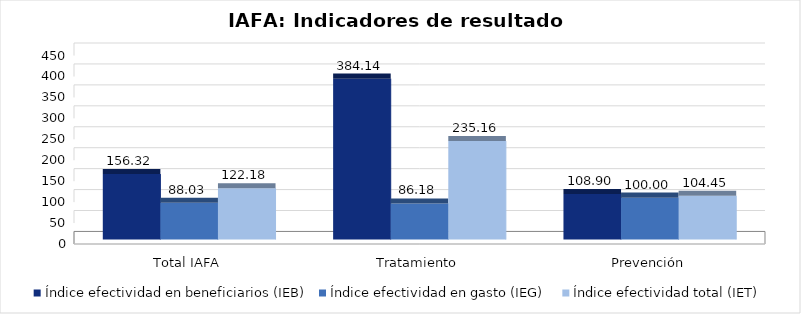
| Category | Índice efectividad en beneficiarios (IEB) | Índice efectividad en gasto (IEG)  | Índice efectividad total (IET) |
|---|---|---|---|
| Total IAFA | 156.32 | 88.03 | 122.175 |
| Tratamiento | 384.136 | 86.182 | 235.159 |
| Prevención | 108.903 | 100 | 104.452 |